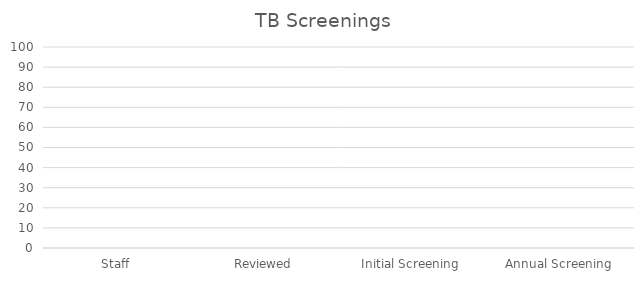
| Category | Series 0 |
|---|---|
| Staff | 0 |
| Reviewed | 0 |
| Initial Screening | 0 |
| Annual Screening | 0 |